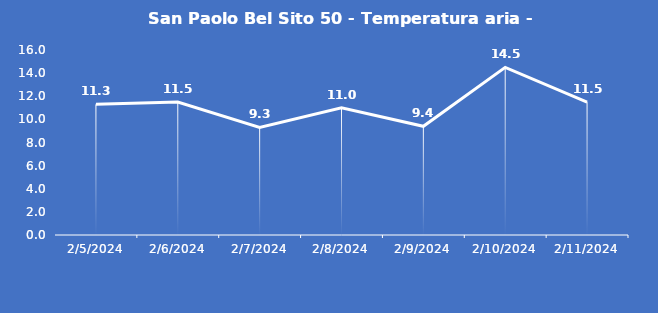
| Category | San Paolo Bel Sito 50 - Temperatura aria - Grezzo (°C) |
|---|---|
| 2/5/24 | 11.3 |
| 2/6/24 | 11.5 |
| 2/7/24 | 9.3 |
| 2/8/24 | 11 |
| 2/9/24 | 9.4 |
| 2/10/24 | 14.5 |
| 2/11/24 | 11.5 |